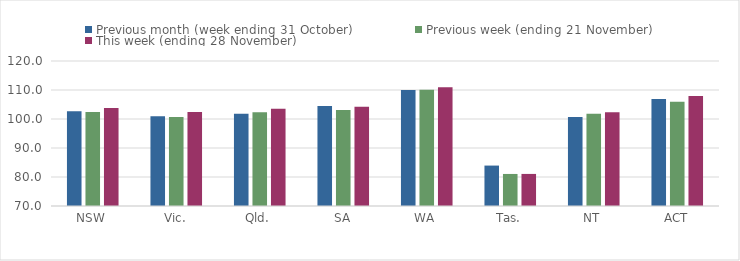
| Category | Previous month (week ending 31 October) | Previous week (ending 21 November) | This week (ending 28 November) |
|---|---|---|---|
| NSW | 102.68 | 102.4 | 103.8 |
| Vic. | 100.94 | 100.66 | 102.41 |
| Qld. | 101.79 | 102.37 | 103.56 |
| SA | 104.45 | 103.14 | 104.22 |
| WA | 109.96 | 110.07 | 110.94 |
| Tas. | 83.94 | 81.05 | 81.06 |
| NT | 100.73 | 101.83 | 102.37 |
| ACT | 106.87 | 105.97 | 107.9 |